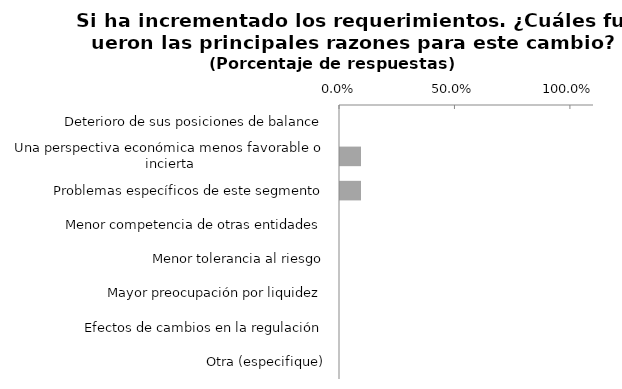
| Category | Series 0 |
|---|---|
| Deterioro de sus posiciones de balance | 0 |
| Una perspectiva económica menos favorable o incierta | 0.091 |
| Problemas específicos de este segmento | 0.091 |
| Menor competencia de otras entidades | 0 |
| Menor tolerancia al riesgo | 0 |
| Mayor preocupación por liquidez | 0 |
| Efectos de cambios en la regulación | 0 |
| Otra (especifique) | 0 |